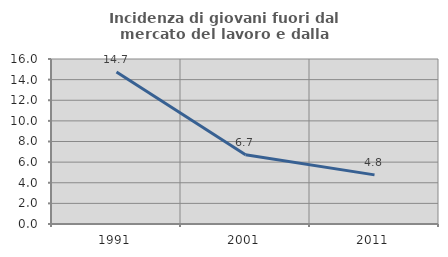
| Category | Incidenza di giovani fuori dal mercato del lavoro e dalla formazione  |
|---|---|
| 1991.0 | 14.744 |
| 2001.0 | 6.72 |
| 2011.0 | 4.762 |